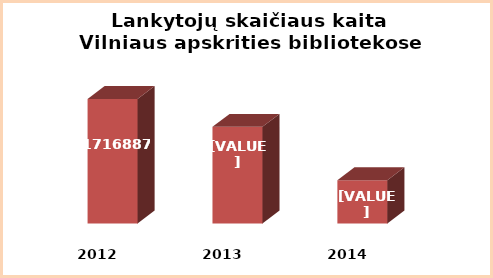
| Category | Series 0 |
|---|---|
| 2012.0 | 1716887 |
| 2013.0 | 1683926 |
| 2014.0 | 1620918 |